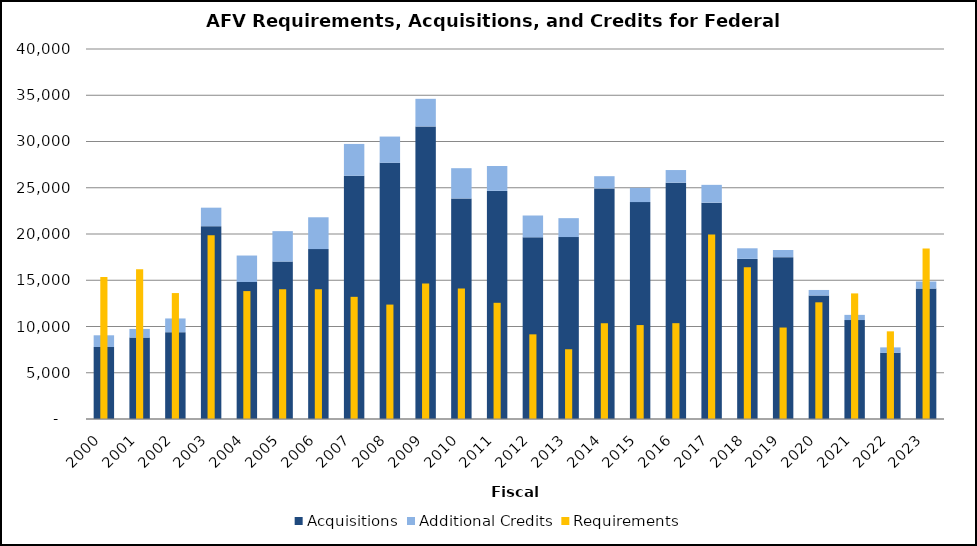
| Category | Acquisitions | Additional Credits |
|---|---|---|
| 2000.0 | 7784 | 1265 |
| 2001.0 | 8798 | 938 |
| 2002.0 | 9387 | 1483 |
| 2003.0 | 20846 | 2000 |
| 2004.0 | 14811 | 2861 |
| 2005.0 | 17018 | 3290 |
| 2006.0 | 18369 | 3439 |
| 2007.0 | 26296 | 3441 |
| 2008.0 | 27696 | 2838 |
| 2009.0 | 31629 | 2985 |
| 2010.0 | 23845 | 3269 |
| 2011.0 | 24662 | 2691 |
| 2012.0 | 19639 | 2360 |
| 2013.0 | 19671 | 2042 |
| 2014.0 | 24930 | 1320 |
| 2015.0 | 23451 | 1543 |
| 2016.0 | 25547 | 1368 |
| 2017.0 | 23389 | 1924 |
| 2018.0 | 17310 | 1145 |
| 2019.0 | 17498 | 774 |
| 2020.0 | 13350 | 600 |
| 2021.0 | 10697 | 560 |
| 2022.0 | 7152 | 590 |
| 2023.0 | 14095 | 768 |